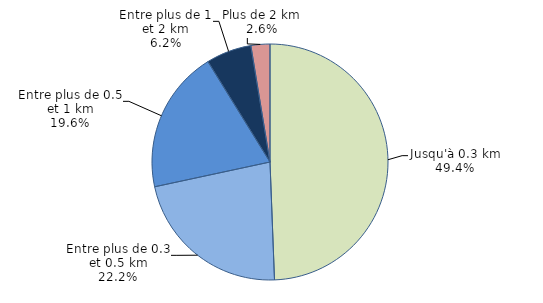
| Category | Series 0 |
|---|---|
| Jusqu'à 0.3 km | 49.392 |
| Entre plus de 0.3 et 0.5 km | 22.237 |
| Entre plus de 0.5 et 1 km | 19.56 |
| Entre plus de 1 et 2 km | 6.214 |
| Plus de 2 km | 2.597 |